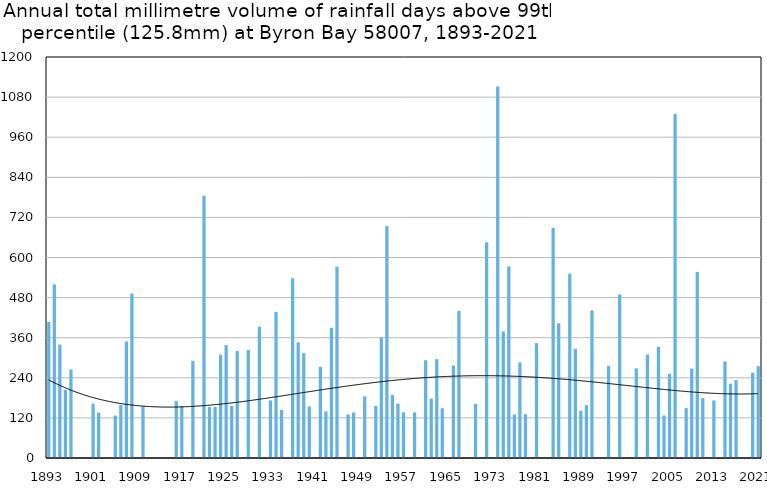
| Category | Annual total mm in days above 99th percentile |
|---|---|
| 1893 | 406.9 |
| 1894 | 519.4 |
| 1895 | 339.4 |
| 1896 | 204 |
| 1897 | 264.7 |
| 1898 | 0 |
| 1899 | 0 |
| 1900 | 0 |
| 1901 | 162.8 |
| 1902 | 136.1 |
| 1903 | 0 |
| 1904 | 0 |
| 1905 | 127 |
| 1906 | 158.8 |
| 1907 | 348.7 |
| 1908 | 492.3 |
| 1909 | 0 |
| 1910 | 154.2 |
| 1911 | 0 |
| 1912 | 0 |
| 1913 | 0 |
| 1914 | 0 |
| 1915 | 0 |
| 1916 | 170.4 |
| 1917 | 154.9 |
| 1918 | 0 |
| 1919 | 290.8 |
| 1920 | 0 |
| 1921 | 784.8 |
| 1922 | 152.4 |
| 1923 | 152.9 |
| 1924 | 309.1 |
| 1925 | 337.8 |
| 1926 | 156.2 |
| 1927 | 320.1 |
| 1928 | 0 |
| 1929 | 323.6 |
| 1930 | 0 |
| 1931 | 392.5 |
| 1932 | 0 |
| 1933 | 172.5 |
| 1934 | 436.8 |
| 1935 | 144 |
| 1936 | 0 |
| 1937 | 537.7 |
| 1938 | 346.2 |
| 1939 | 313.7 |
| 1940 | 154.4 |
| 1941 | 0 |
| 1942 | 273 |
| 1943 | 139.7 |
| 1944 | 389.9 |
| 1945 | 572.6 |
| 1946 | 0 |
| 1947 | 130.6 |
| 1948 | 136.1 |
| 1949 | 0 |
| 1950 | 184.4 |
| 1951 | 0 |
| 1952 | 156 |
| 1953 | 360.5 |
| 1954 | 693.9 |
| 1955 | 188.7 |
| 1956 | 162.8 |
| 1957 | 136.9 |
| 1958 | 0 |
| 1959 | 136.7 |
| 1960 | 0 |
| 1961 | 292.6 |
| 1962 | 177.8 |
| 1963 | 296 |
| 1964 | 148.8 |
| 1965 | 0 |
| 1966 | 276.8 |
| 1967 | 440.2 |
| 1968 | 0 |
| 1969 | 0 |
| 1970 | 162.1 |
| 1971 | 0 |
| 1972 | 645.4 |
| 1973 | 0 |
| 1974 | 1111.6 |
| 1975 | 378.8 |
| 1976 | 573.4 |
| 1977 | 129.8 |
| 1978 | 286.2 |
| 1979 | 131.2 |
| 1980 | 0 |
| 1981 | 343.8 |
| 1982 | 0 |
| 1983 | 0 |
| 1984 | 688.4 |
| 1985 | 403.1 |
| 1986 | 0 |
| 1987 | 551.8 |
| 1988 | 326.5 |
| 1989 | 141.6 |
| 1990 | 158.3 |
| 1991 | 441.9 |
| 1992 | 0 |
| 1993 | 0 |
| 1994 | 275.7 |
| 1995 | 0 |
| 1996 | 489.3 |
| 1997 | 0 |
| 1998 | 0 |
| 1999 | 268.2 |
| 2000 | 0 |
| 2001 | 309.8 |
| 2002 | 0 |
| 2003 | 332.6 |
| 2004 | 127.2 |
| 2005 | 252.4 |
| 2006 | 1029.2 |
| 2007 | 0 |
| 2008 | 149.2 |
| 2009 | 267.4 |
| 2010 | 557 |
| 2011 | 179.4 |
| 2012 | 0 |
| 2013 | 172.2 |
| 2014 | 0 |
| 2015 | 288.8 |
| 2016 | 222.4 |
| 2017 | 233.2 |
| 2018 | 0 |
| 2019 | 0 |
| 2020 | 255.2 |
| 2021 | 274.6 |